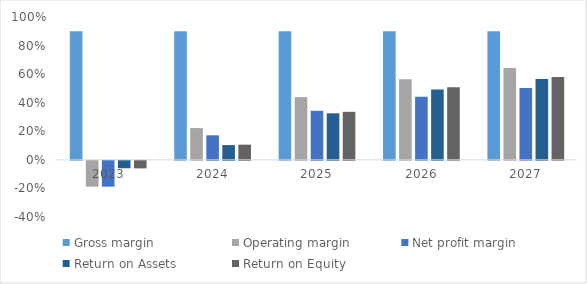
| Category | Gross margin | Operating margin | Net profit margin | Return on Assets | Return on Equity |
|---|---|---|---|---|---|
| 2023-12-01 | 0.9 | -0.181 | -0.181 | -0.052 | -0.053 |
| 2024-12-01 | 0.9 | 0.223 | 0.172 | 0.104 | 0.106 |
| 2025-12-01 | 0.9 | 0.439 | 0.344 | 0.326 | 0.336 |
| 2026-12-01 | 0.9 | 0.564 | 0.442 | 0.493 | 0.507 |
| 2027-12-01 | 0.9 | 0.643 | 0.504 | 0.566 | 0.579 |